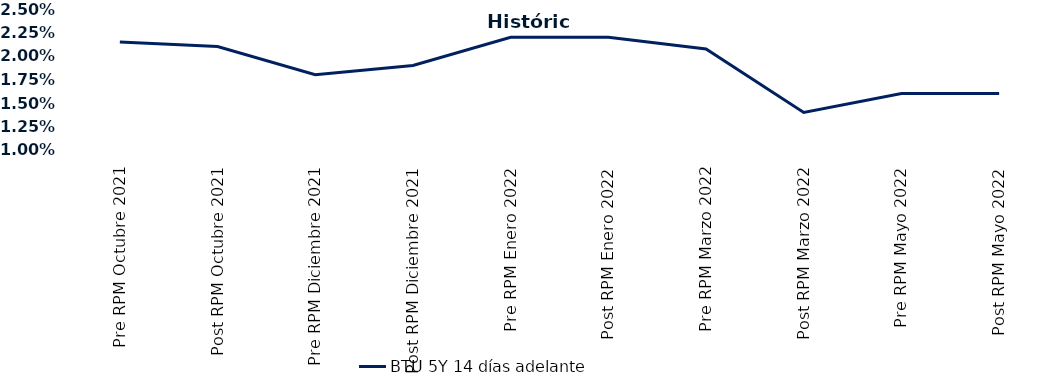
| Category | BTU 5Y 14 días adelante |
|---|---|
| Pre RPM Octubre 2021 | 0.022 |
| Post RPM Octubre 2021 | 0.021 |
| Pre RPM Diciembre 2021 | 0.018 |
| Post RPM Diciembre 2021 | 0.019 |
| Pre RPM Enero 2022 | 0.022 |
| Post RPM Enero 2022 | 0.022 |
| Pre RPM Marzo 2022 | 0.021 |
| Post RPM Marzo 2022 | 0.014 |
| Pre RPM Mayo 2022 | 0.016 |
| Post RPM Mayo 2022 | 0.016 |